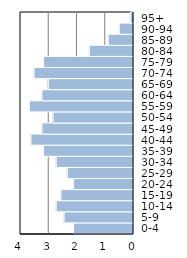
| Category | Series 0 |
|---|---|
| 0-4 | 2.122 |
| 5-9 | 2.457 |
| 10-14 | 2.736 |
| 15-19 | 2.568 |
| 20-24 | 2.122 |
| 25-29 | 2.345 |
| 30-34 | 2.736 |
| 35-39 | 3.183 |
| 40-44 | 3.629 |
| 45-49 | 3.238 |
| 50-54 | 2.848 |
| 55-59 | 3.685 |
| 60-64 | 3.238 |
| 65-69 | 3.015 |
| 70-74 | 3.518 |
| 75-79 | 3.183 |
| 80-84 | 1.563 |
| 85-89 | 0.893 |
| 90-94 | 0.503 |
| 95+ | 0.112 |